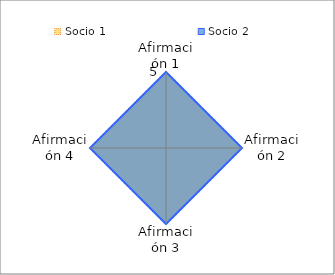
| Category | Socio 1 | Socio 2 |
|---|---|---|
| Afirmación 1 | 5 | 5 |
| Afirmación 2 | 5 | 5 |
| Afirmación 3 | 5 | 5 |
| Afirmación 4 | 5 | 5 |